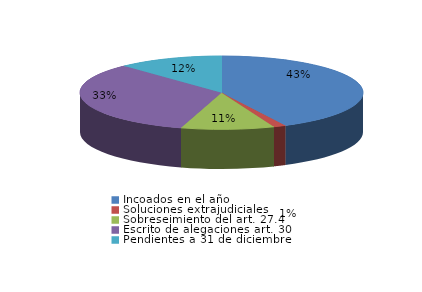
| Category | Series 0 |
|---|---|
| Incoados en el año | 60 |
| Soluciones extrajudiciales | 2 |
| Sobreseimiento del art. 27.4 | 15 |
| Escrito de alegaciones art. 30 | 47 |
| Pendientes a 31 de diciembre | 17 |